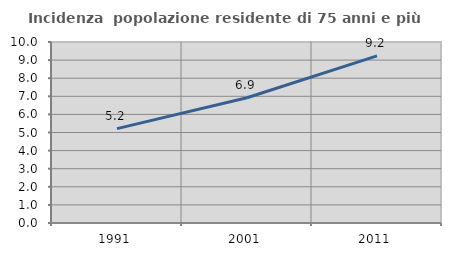
| Category | Incidenza  popolazione residente di 75 anni e più |
|---|---|
| 1991.0 | 5.214 |
| 2001.0 | 6.922 |
| 2011.0 | 9.235 |